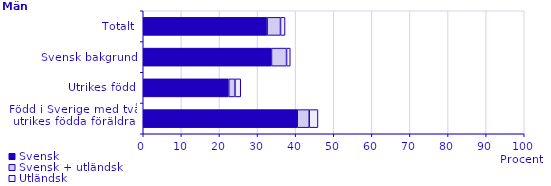
| Category | Svensk | Svensk + utländsk | Utländsk |
|---|---|---|---|
| Född i Sverige med två 
utrikes födda föräldrar | 40.419 | 3.14 | 2.295 |
| Utrikes född | 22.438 | 1.637 | 1.518 |
| Svensk bakgrund | 33.657 | 3.953 | 0.978 |
| Totalt | 32.514 | 3.511 | 1.186 |